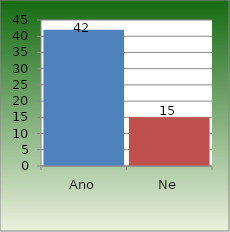
| Category | Series 0 |
|---|---|
| Ano | 42 |
| Ne | 15 |